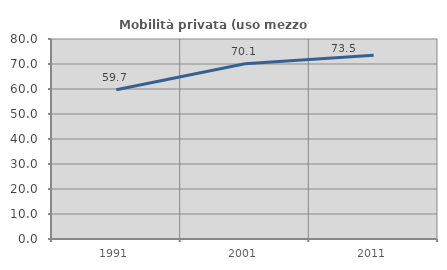
| Category | Mobilità privata (uso mezzo privato) |
|---|---|
| 1991.0 | 59.735 |
| 2001.0 | 70.079 |
| 2011.0 | 73.497 |